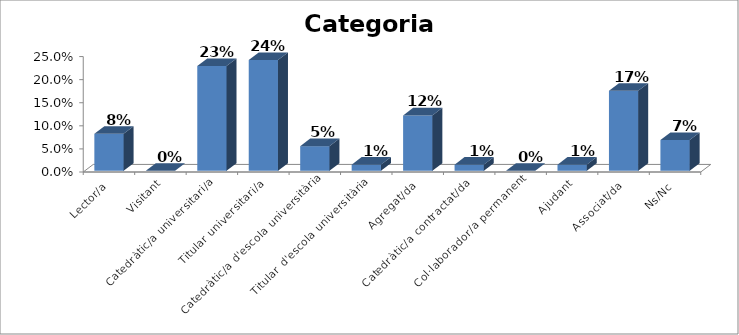
| Category | % |
|---|---|
| Lector/a | 0.08 |
| Visitant | 0 |
| Catedràtic/a universitari/a | 0.227 |
| Titular universitari/a | 0.24 |
| Catedràtic/a d'escola universitària | 0.053 |
| Titular d'escola universitària | 0.013 |
| Agregat/da | 0.12 |
| Catedràtic/a contractat/da | 0.013 |
| Col·laborador/a permanent | 0 |
| Ajudant | 0.013 |
| Associat/da | 0.173 |
| Ns/Nc | 0.067 |